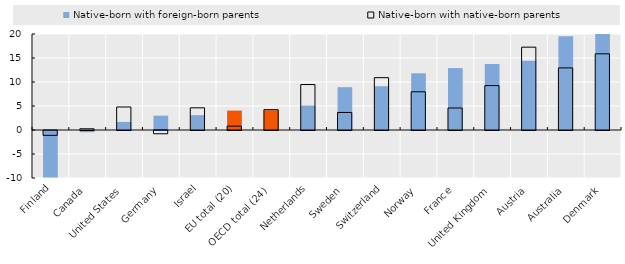
| Category | Native-born with foreign-born parents | Native-born with native-born parents |
|---|---|---|
| Finland | -9.698 | -1.011 |
| Canada | -0.262 | 0.251 |
| United States | 1.684 | 4.792 |
| Germany | 2.992 | -0.683 |
| Israel | 3.095 | 4.621 |
| EU total (20) | 4.041 | 0.804 |
| OECD total (24) | 4.117 | 4.238 |
| Netherlands | 5.094 | 9.471 |
| Sweden | 8.924 | 3.657 |
| Switzerland | 9.121 | 10.903 |
| Norway | 11.809 | 7.96 |
| France | 12.9 | 4.582 |
| United Kingdom | 13.725 | 9.255 |
| Austria | 14.412 | 17.258 |
| Australia | 19.524 | 12.935 |
| Denmark | 26.68 | 15.87 |